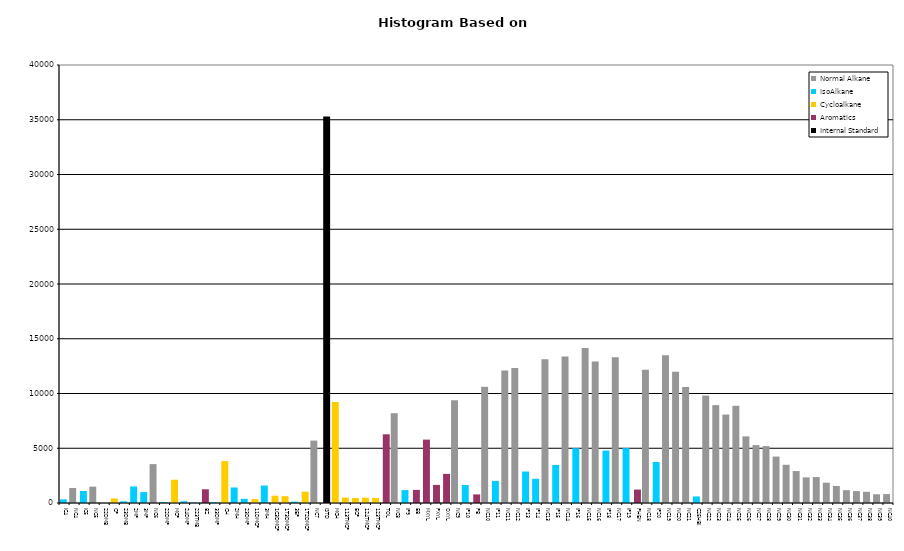
| Category | Normal Alkane | IsoAlkane | Cycloalkane | Aromatics | Internal Standard |
|---|---|---|---|---|---|
| IC4 | 0 | 335 | 0 | 0 | 0 |
| NC4 | 1374 | 0 | 0 | 0 | 0 |
| IC5 | 0 | 1096 | 0 | 0 | 0 |
| NC5 | 1491 | 0 | 0 | 0 | 0 |
| 22DMB | 0 | 0 | 0 | 0 | 0 |
| CP | 0 | 0 | 415 | 0 | 0 |
| 23DMB | 0 | 155 | 0 | 0 | 0 |
| 2MP | 0 | 1515 | 0 | 0 | 0 |
| 3MP | 0 | 995 | 0 | 0 | 0 |
| NC6 | 3550 | 0 | 0 | 0 | 0 |
| 22DMP | 0 | 83 | 0 | 0 | 0 |
| MCP | 0 | 0 | 2127 | 0 | 0 |
| 24DMP | 0 | 158 | 0 | 0 | 0 |
| 223TMB | 0 | 34 | 0 | 0 | 0 |
| BZ | 0 | 0 | 0 | 1254 | 0 |
| 33DMP | 0 | 78 | 0 | 0 | 0 |
| CH | 0 | 0 | 3829 | 0 | 0 |
| 2MH | 0 | 1415 | 0 | 0 | 0 |
| 23DMP | 0 | 380 | 0 | 0 | 0 |
| 11DMCP | 0 | 0 | 360 | 0 | 0 |
| 3MH | 0 | 1595 | 0 | 0 | 0 |
| 1C3DMCP | 0 | 0 | 667 | 0 | 0 |
| 1T3DMCP | 0 | 0 | 620 | 0 | 0 |
| 3EP | 0 | 122 | 0 | 0 | 0 |
| 1T2DMCP | 0 | 0 | 1034 | 0 | 0 |
| NC7 | 5700 | 0 | 0 | 0 | 0 |
| ISTD | 0 | 0 | 0 | 0 | 35305 |
| MCH | 0 | 0 | 9221 | 0 | 0 |
| 113TMCP | 0 | 0 | 499 | 0 | 0 |
| ECP | 0 | 0 | 452 | 0 | 0 |
| 124TMCP | 0 | 0 | 480 | 0 | 0 |
| 123TMCP | 0 | 0 | 462 | 0 | 0 |
| TOL | 0 | 0 | 0 | 6273 | 0 |
| NC8 | 8200 | 0 | 0 | 0 | 0 |
| IP9 | 0 | 1177 | 0 | 0 | 0 |
| EB | 0 | 0 | 0 | 1198 | 0 |
| MXYL | 0 | 0 | 0 | 5789 | 0 |
| PXYL | 0 | 0 | 0 | 1649 | 0 |
| OXYL | 0 | 0 | 0 | 2658 | 0 |
| NC9 | 9381 | 0 | 0 | 0 | 0 |
| IP10 | 0 | 1642 | 0 | 0 | 0 |
| PB | 0 | 0 | 0 | 786 | 0 |
| NC10 | 10612 | 0 | 0 | 0 | 0 |
| IP11 | 0 | 2016 | 0 | 0 | 0 |
| NC11 | 12091 | 0 | 0 | 0 | 0 |
| NC12 | 12333 | 0 | 0 | 0 | 0 |
| IP13 | 0 | 2873 | 0 | 0 | 0 |
| IP14 | 0 | 2212 | 0 | 0 | 0 |
| NC13 | 13117 | 0 | 0 | 0 | 0 |
| IP15 | 0 | 3475 | 0 | 0 | 0 |
| NC14 | 13380 | 0 | 0 | 0 | 0 |
| IP16 | 0 | 5003 | 0 | 0 | 0 |
| NC15 | 14144 | 0 | 0 | 0 | 0 |
| NC16 | 12933 | 0 | 0 | 0 | 0 |
| IP18 | 0 | 4791 | 0 | 0 | 0 |
| NC17 | 13305 | 0 | 0 | 0 | 0 |
| IP19 | 0 | 5011 | 0 | 0 | 0 |
| PHEN | 0 | 0 | 0 | 1229 | 0 |
| NC18 | 12164 | 0 | 0 | 0 | 0 |
| IP20 | 0 | 3743 | 0 | 0 | 0 |
| NC19 | 13482 | 0 | 0 | 0 | 0 |
| NC20 | 11995 | 0 | 0 | 0 | 0 |
| NC21 | 10596 | 0 | 0 | 0 | 0 |
| C25HBI | 0 | 600 | 0 | 0 | 0 |
| NC22 | 9815 | 0 | 0 | 0 | 0 |
| NC23 | 8940 | 0 | 0 | 0 | 0 |
| NC24 | 8077 | 0 | 0 | 0 | 0 |
| NC25 | 8876 | 0 | 0 | 0 | 0 |
| NC26 | 6083 | 0 | 0 | 0 | 0 |
| NC27 | 5285 | 0 | 0 | 0 | 0 |
| NC28 | 5197 | 0 | 0 | 0 | 0 |
| NC29 | 4239 | 0 | 0 | 0 | 0 |
| NC30 | 3490 | 0 | 0 | 0 | 0 |
| NC31 | 2917 | 0 | 0 | 0 | 0 |
| NC32 | 2340 | 0 | 0 | 0 | 0 |
| NC33 | 2366 | 0 | 0 | 0 | 0 |
| NC34 | 1853 | 0 | 0 | 0 | 0 |
| NC35 | 1551 | 0 | 0 | 0 | 0 |
| NC36 | 1172 | 0 | 0 | 0 | 0 |
| NC37 | 1087 | 0 | 0 | 0 | 0 |
| NC38 | 1025 | 0 | 0 | 0 | 0 |
| NC39 | 796 | 0 | 0 | 0 | 0 |
| NC40 | 814 | 0 | 0 | 0 | 0 |